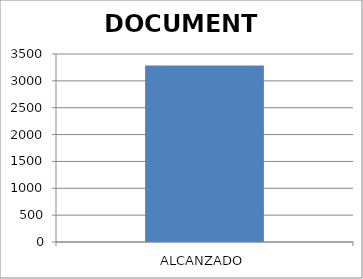
| Category | DOCUMENTO |
|---|---|
| ALCANZADO | 3284 |